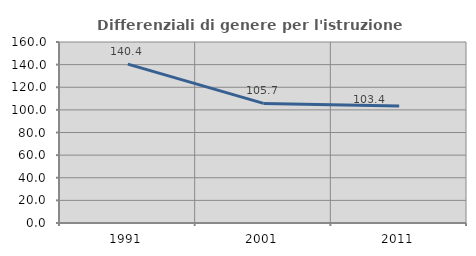
| Category | Differenziali di genere per l'istruzione superiore |
|---|---|
| 1991.0 | 140.405 |
| 2001.0 | 105.705 |
| 2011.0 | 103.371 |